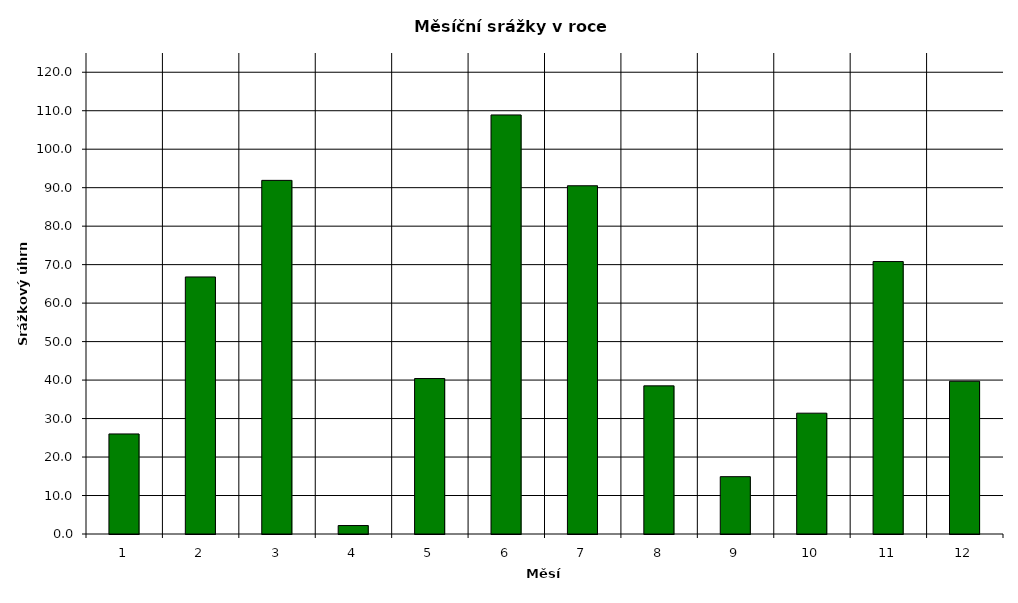
| Category | Series 0 |
|---|---|
| 0 | 26 |
| 1 | 66.8 |
| 2 | 91.9 |
| 3 | 2.2 |
| 4 | 40.4 |
| 5 | 108.9 |
| 6 | 90.5 |
| 7 | 38.5 |
| 8 | 14.9 |
| 9 | 31.4 |
| 10 | 70.8 |
| 11 | 39.7 |